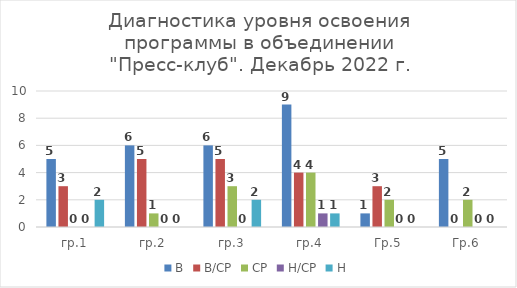
| Category | В | В/СР | СР | Н/СР | Н |
|---|---|---|---|---|---|
| гр.1 | 5 | 3 | 0 | 0 | 2 |
| гр.2 | 6 | 5 | 1 | 0 | 0 |
| гр.3 | 6 | 5 | 3 | 0 | 2 |
| гр.4 | 9 | 4 | 4 | 1 | 1 |
| Гр.5 | 1 | 3 | 2 | 0 | 0 |
| Гр.6 | 5 | 0 | 2 | 0 | 0 |